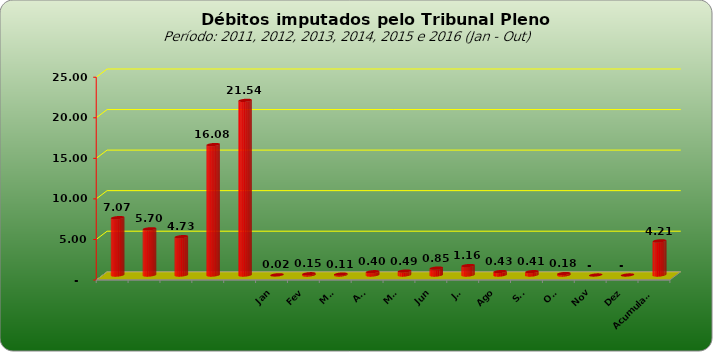
| Category |  7.073.154,74  |
|---|---|
|  | 7073154.74 |
|  | 5698720.25 |
|  | 4727033.51 |
|  | 16081820.48 |
|  | 21535723.6 |
| Jan | 22059.63 |
| Fev | 154318.14 |
| Mar | 112460.95 |
| Abr | 404403.01 |
| Mai | 486409.52 |
| Jun | 852405.84 |
| Jul | 1163444.79 |
| Ago | 426141.81 |
| Set | 412616.73 |
| Out | 176372.2 |
| Nov | 0 |
| Dez | 0 |
| Acumulado | 4210632.62 |